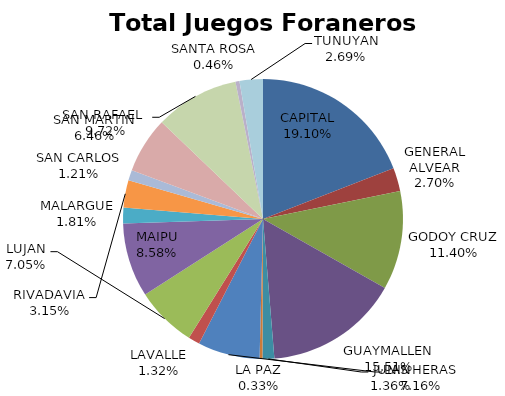
| Category | Total Juegos Foraneros Recaudación  |
|---|---|
| CAPITAL | 4980996 |
| GENERAL ALVEAR | 704170 |
| GODOY CRUZ | 2972656 |
| GUAYMALLEN | 4045378 |
| JUNIN | 354646 |
| LA PAZ | 85350 |
| LAS HERAS | 1867373 |
| LAVALLE | 344967 |
| LUJAN | 1838916 |
| MAIPU | 2236678 |
| MALARGUE | 472321 |
| RIVADAVIA | 821155 |
| SAN CARLOS | 315623 |
| SAN MARTIN | 1685558 |
| SAN RAFAEL  | 2534317 |
| SANTA ROSA | 120402 |
| TUNUYAN | 702436 |